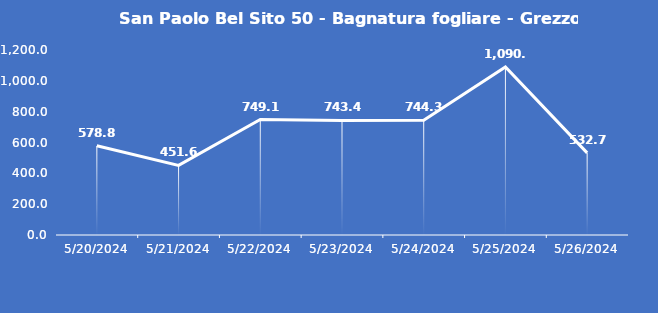
| Category | San Paolo Bel Sito 50 - Bagnatura fogliare - Grezzo (min) |
|---|---|
| 5/20/24 | 578.8 |
| 5/21/24 | 451.6 |
| 5/22/24 | 749.1 |
| 5/23/24 | 743.4 |
| 5/24/24 | 744.3 |
| 5/25/24 | 1090.5 |
| 5/26/24 | 532.7 |